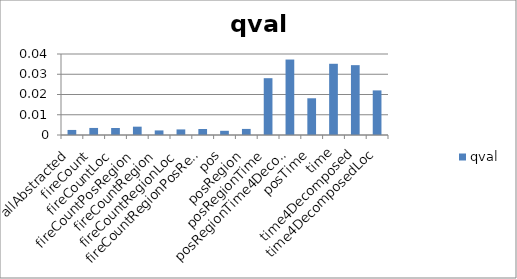
| Category | qval |
|---|---|
| allAbstracted | 0.003 |
| fireCount | 0.003 |
| fireCountLoc | 0.003 |
| fireCountPosRegion | 0.004 |
| fireCountRegion | 0.002 |
| fireCountRegionLoc | 0.003 |
| fireCountRegionPosRegion | 0.003 |
| pos | 0.002 |
| posRegion | 0.003 |
| posRegionTime | 0.028 |
| posRegionTime4Decomposed | 0.037 |
| posTime | 0.018 |
| time | 0.035 |
| time4Decomposed | 0.034 |
| time4DecomposedLoc | 0.022 |